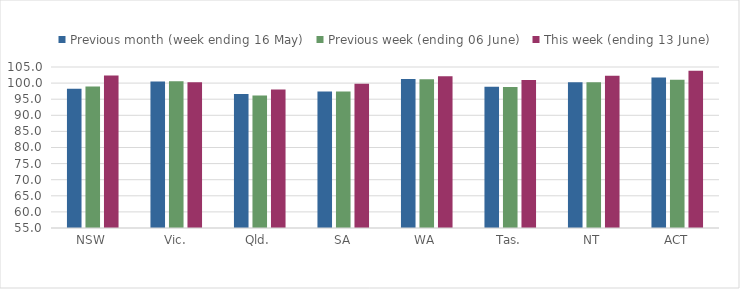
| Category | Previous month (week ending 16 May) | Previous week (ending 06 June) | This week (ending 13 June) |
|---|---|---|---|
| NSW | 98.246 | 98.944 | 102.396 |
| Vic. | 100.525 | 100.536 | 100.227 |
| Qld. | 96.603 | 96.172 | 97.977 |
| SA | 97.425 | 97.425 | 99.794 |
| WA | 101.249 | 101.22 | 102.145 |
| Tas. | 98.894 | 98.794 | 100.975 |
| NT | 100.241 | 100.241 | 102.246 |
| ACT | 101.773 | 101.064 | 103.809 |